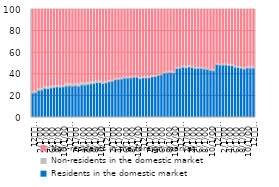
| Category | Residents in the domestic market | Non-residents in the domestic market | Non-residents in the foreign market |
|---|---|---|---|
| 12
2013 | 22.746 | 0.884 | 76.37 |
| 1 | 23.113 | 1.21 | 75.676 |
| 2 | 25.082 | 1.193 | 73.725 |
| 3 | 25.523 | 1.082 | 73.395 |
| 4 | 27.022 | 1.419 | 71.559 |
| 5 | 26.732 | 1.389 | 71.879 |
| 6 | 27.449 | 1.371 | 71.18 |
| 7 | 27.865 | 1.314 | 70.821 |
| 8 | 28.399 | 1.263 | 70.338 |
| 9 | 28.112 | 1.261 | 70.627 |
| 10 | 28.396 | 1.308 | 70.296 |
| 11 | 29.056 | 2.275 | 68.669 |
| 12
2014 | 29.222 | 2.157 | 68.621 |
| 1 | 28.996 | 1.846 | 69.158 |
| 2 | 29.375 | 2.156 | 68.469 |
| 3 | 28.86 | 2.123 | 69.017 |
| 4 | 30.112 | 1.915 | 67.972 |
| 5 | 30.094 | 1.642 | 68.263 |
| 6 | 30.54 | 1.666 | 67.794 |
| 7 | 31.186 | 1.524 | 67.29 |
| 8 | 31.557 | 1.585 | 66.858 |
| 9 | 32.403 | 1.199 | 66.398 |
| 10 | 32.369 | 1.176 | 66.455 |
| 11 | 31.432 | 1.144 | 67.424 |
| 12
2015 | 32.295 | 1.065 | 66.64 |
| 1 | 33.081 | 1.013 | 65.907 |
| 2 | 33.56 | 0.847 | 65.593 |
| 3 | 35.045 | 0.74 | 64.216 |
| 4 | 35.12 | 0.702 | 64.177 |
| 5 | 35.666 | 0.849 | 63.484 |
| 6 | 36.486 | 0.776 | 62.739 |
| 7 | 36.47 | 0.751 | 62.779 |
| 8 | 36.672 | 0.676 | 62.652 |
| 9 | 37.327 | 0.673 | 62 |
| 10 | 37.415 | 0.656 | 61.929 |
| 11 | 35.998 | 0.759 | 63.243 |
| 12
2016 | 36.713 | 0.701 | 62.586 |
| 1 | 36.757 | 0.676 | 62.567 |
| 2 | 36.741 | 0.675 | 62.584 |
| 3 | 37.619 | 0.726 | 61.655 |
| 4 | 37.923 | 0.745 | 61.332 |
| 5 | 38.982 | 0.741 | 60.277 |
| 6 | 39.517 | 0.655 | 59.828 |
| 7 | 41.023 | 0.695 | 58.282 |
| 8 | 41.301 | 0.699 | 58 |
| 9 | 41.537 | 0.776 | 57.687 |
| 10 | 41.277 | 0.747 | 57.976 |
| 11 | 45.37 | 0.839 | 53.792 |
| 12
2017 | 45.716 | 0.72 | 53.564 |
| 1 | 46.55 | 0.973 | 52.477 |
| 2 | 46.09 | 0.947 | 52.964 |
| 3 | 46.816 | 0.875 | 52.308 |
| 4 | 46.346 | 0.82 | 52.834 |
| 5 | 45.455 | 0.786 | 53.759 |
| 6 | 45.49 | 0.789 | 53.721 |
| 7 | 45.446 | 0.714 | 53.841 |
| 8 | 44.864 | 0.694 | 54.443 |
| 9 | 44.608 | 0.681 | 54.711 |
| 10 | 43.66 | 0.664 | 55.676 |
| 11 | 43.209 | 0.625 | 56.166 |
| 12
2018 | 49.022 | 0.553 | 50.425 |
| 1 | 48.569 | 0.551 | 50.879 |
| 2 | 48.613 | 0.653 | 50.735 |
| 3 | 48.634 | 0.688 | 50.678 |
| 4 | 48.22 | 0.694 | 51.086 |
| 5 | 48.072 | 0.822 | 51.106 |
| 6 | 46.599 | 0.971 | 52.429 |
| 7 | 46.234 | 0.958 | 52.808 |
| 8 | 45.641 | 0.929 | 53.43 |
| 9 | 44.859 | 0.936 | 54.205 |
| 10 | 45.829 | 1.104 | 53.067 |
| 11 | 45.494 | 1.096 | 53.409 |
| 12
2019 | 45.723 | 1.083 | 53.194 |